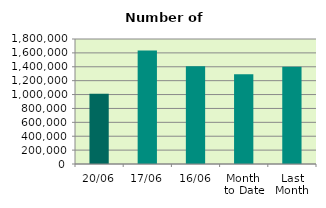
| Category | Series 0 |
|---|---|
| 20/06 | 1010282 |
| 17/06 | 1632664 |
| 16/06 | 1406866 |
| Month 
to Date | 1292224.429 |
| Last
Month | 1401172.455 |